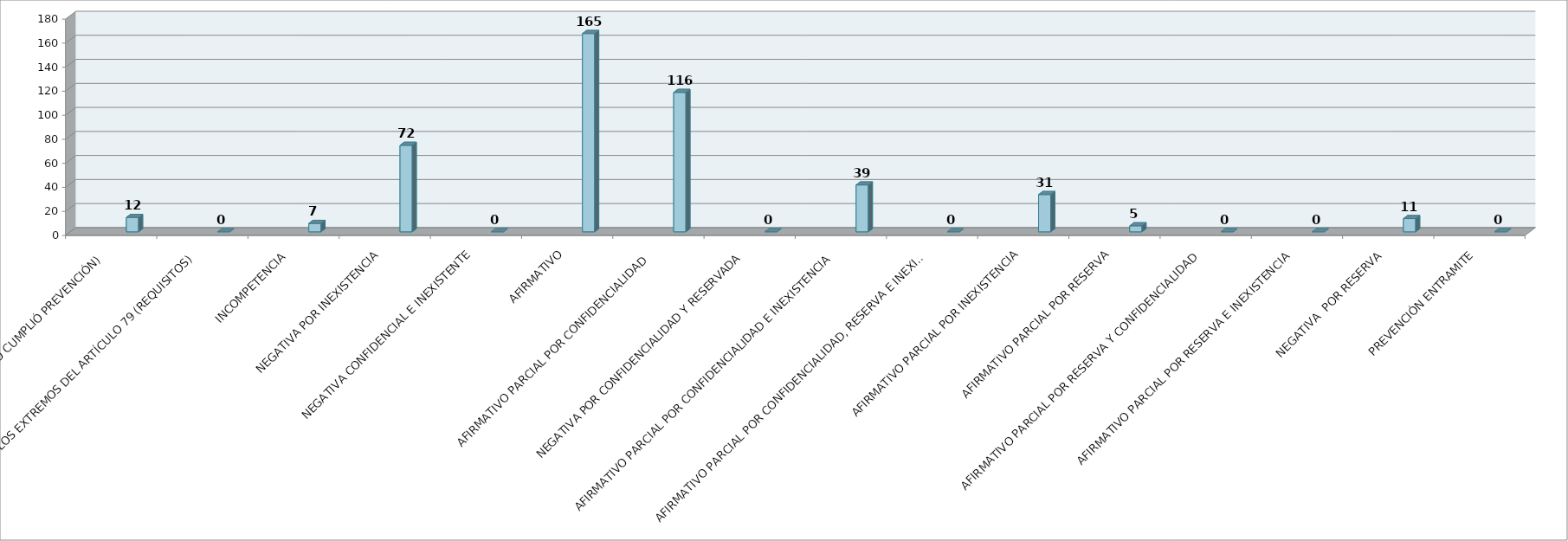
| Category | Series 0 | Series 1 | Series 2 | Series 3 | Series 4 | Series 5 |
|---|---|---|---|---|---|---|
| SE TIENE POR NO PRESENTADA ( NO CUMPLIÓ PREVENCIÓN) |  |  |  |  | 12 |  |
| NO CUMPLIO CON LOS EXTREMOS DEL ARTÍCULO 79 (REQUISITOS) |  |  |  |  | 0 |  |
| INCOMPETENCIA  |  |  |  |  | 7 |  |
| NEGATIVA POR INEXISTENCIA |  |  |  |  | 72 |  |
| NEGATIVA CONFIDENCIAL E INEXISTENTE |  |  |  |  | 0 |  |
| AFIRMATIVO |  |  |  |  | 165 |  |
| AFIRMATIVO PARCIAL POR CONFIDENCIALIDAD  |  |  |  |  | 116 |  |
| NEGATIVA POR CONFIDENCIALIDAD Y RESERVADA |  |  |  |  | 0 |  |
| AFIRMATIVO PARCIAL POR CONFIDENCIALIDAD E INEXISTENCIA |  |  |  |  | 39 |  |
| AFIRMATIVO PARCIAL POR CONFIDENCIALIDAD, RESERVA E INEXISTENCIA |  |  |  |  | 0 |  |
| AFIRMATIVO PARCIAL POR INEXISTENCIA |  |  |  |  | 31 |  |
| AFIRMATIVO PARCIAL POR RESERVA |  |  |  |  | 5 |  |
| AFIRMATIVO PARCIAL POR RESERVA Y CONFIDENCIALIDAD |  |  |  |  | 0 |  |
| AFIRMATIVO PARCIAL POR RESERVA E INEXISTENCIA |  |  |  |  | 0 |  |
| NEGATIVA  POR RESERVA |  |  |  |  | 11 |  |
| PREVENCIÓN ENTRAMITE |  |  |  |  | 0 |  |